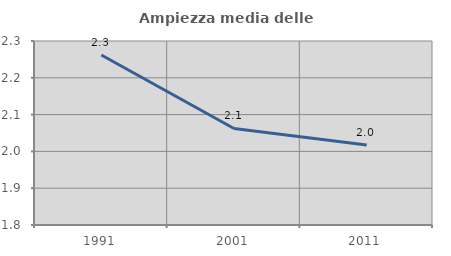
| Category | Ampiezza media delle famiglie |
|---|---|
| 1991.0 | 2.262 |
| 2001.0 | 2.062 |
| 2011.0 | 2.017 |